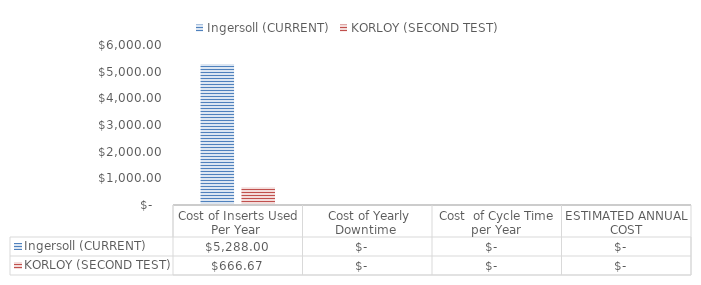
| Category | Ingersoll (CURRENT) | KORLOY (SECOND TEST) |
|---|---|---|
| Cost of Inserts Used Per Year  | 5288 | 666.667 |
|  Cost of Yearly Downtime  | 0 | 0 |
| Cost  of Cycle Time per Year | 0 | 0 |
| ESTIMATED ANNUAL COST | 0 | 0 |